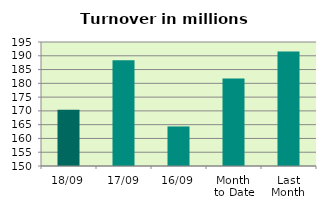
| Category | Series 0 |
|---|---|
| 18/09 | 170.438 |
| 17/09 | 188.377 |
| 16/09 | 164.356 |
| Month 
to Date | 181.743 |
| Last
Month | 191.512 |